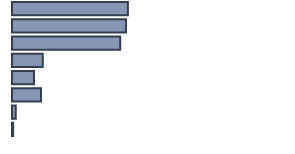
| Category | Series 0 |
|---|---|
| 0 | 42.3 |
| 1 | 41.6 |
| 2 | 39.5 |
| 3 | 11.2 |
| 4 | 8 |
| 5 | 10.609 |
| 6 | 1.367 |
| 7 | 0.411 |